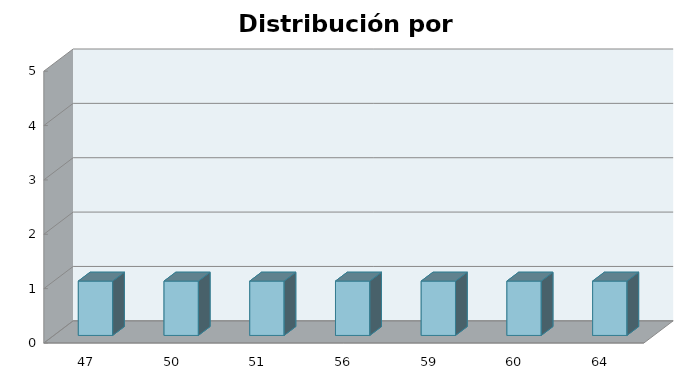
| Category | Series 1 |
|---|---|
| 47.0 | 1 |
| 50.0 | 1 |
| 51.0 | 1 |
| 56.0 | 1 |
| 59.0 | 1 |
| 60.0 | 1 |
| 64.0 | 1 |